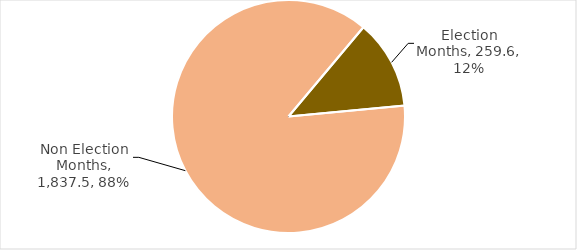
| Category | Total Grants |
|---|---|
| Election Months | 259.642 |
| Non Election Months | 1837.519 |